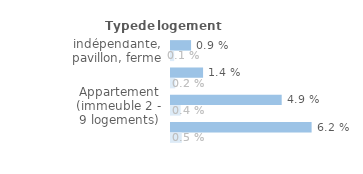
| Category | Series 1 | Series 0 |
|---|---|---|
| Maison indépendante, pavillon, ferme | 0.009 | 0.001 |
| Maison de ville groupée | 0.014 | 0.002 |
| Appartement (immeuble 2 - 9 logements) | 0.049 | 0.004 |
| Appartement (immeuble de 10 logements ou +) | 0.062 | 0.005 |